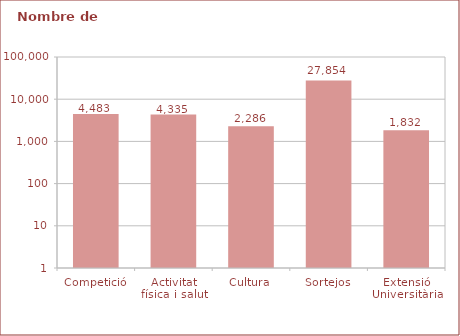
| Category | Nombre de participants |
|---|---|
| Competició | 4483 |
| Activitat física i salut | 4335 |
| Cultura | 2286 |
| Sortejos | 27854 |
| Extensió Universitària | 1832 |